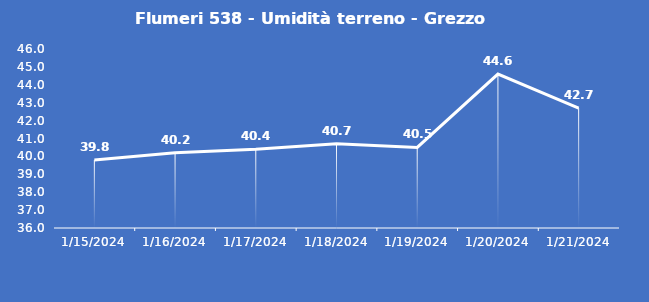
| Category | Flumeri 538 - Umidità terreno - Grezzo (%VWC) |
|---|---|
| 1/15/24 | 39.8 |
| 1/16/24 | 40.2 |
| 1/17/24 | 40.4 |
| 1/18/24 | 40.7 |
| 1/19/24 | 40.5 |
| 1/20/24 | 44.6 |
| 1/21/24 | 42.7 |